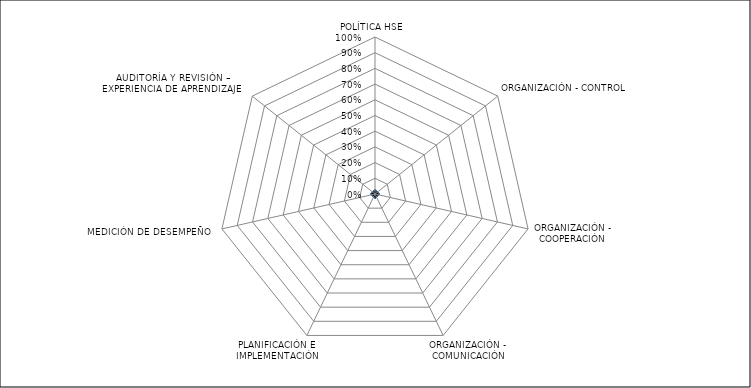
| Category | Series 0 |
|---|---|
| POLÍTICA HSE | 0 |
| ORGANIZACIÓN - CONTROL | 0 |
| ORGANIZACIÓN - COOPERACIÓN | 0 |
| ORGANIZACIÓN - COMUNICACIÓN | 0 |
| PLANIFICACIÓN E IMPLEMENTACIÓN | 0 |
| MEDICIÓN DE DESEMPEÑO | 0 |
| AUDITORÍA Y REVISIÓN – EXPERIENCIA DE APRENDIZAJE | 0 |